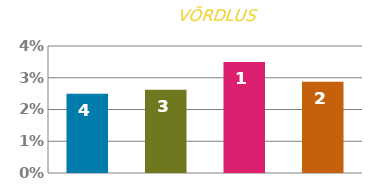
| Category | MÄÄR |
|---|---|
| 0 | 0.025 |
| 1 | 0.026 |
| 2 | 0.035 |
| 3 | 0.029 |